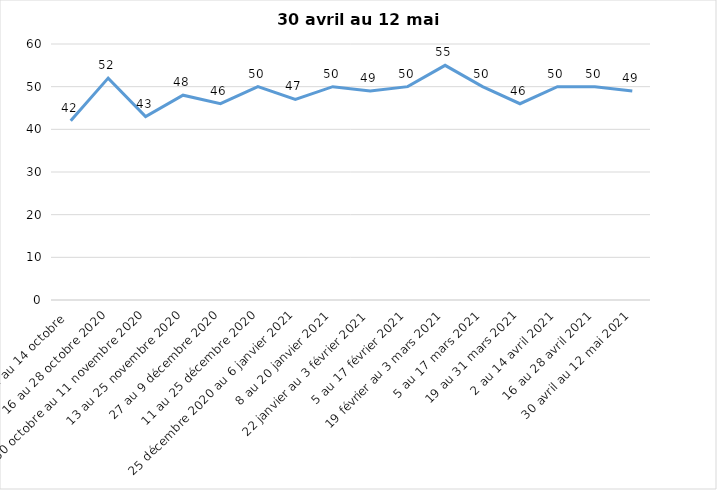
| Category | Toujours aux trois mesures |
|---|---|
| 2 au 14 octobre  | 42 |
| 16 au 28 octobre 2020 | 52 |
| 30 octobre au 11 novembre 2020 | 43 |
| 13 au 25 novembre 2020 | 48 |
| 27 au 9 décembre 2020 | 46 |
| 11 au 25 décembre 2020 | 50 |
| 25 décembre 2020 au 6 janvier 2021 | 47 |
| 8 au 20 janvier 2021 | 50 |
| 22 janvier au 3 février 2021 | 49 |
| 5 au 17 février 2021 | 50 |
| 19 février au 3 mars 2021 | 55 |
| 5 au 17 mars 2021 | 50 |
| 19 au 31 mars 2021 | 46 |
| 2 au 14 avril 2021 | 50 |
| 16 au 28 avril 2021 | 50 |
| 30 avril au 12 mai 2021 | 49 |